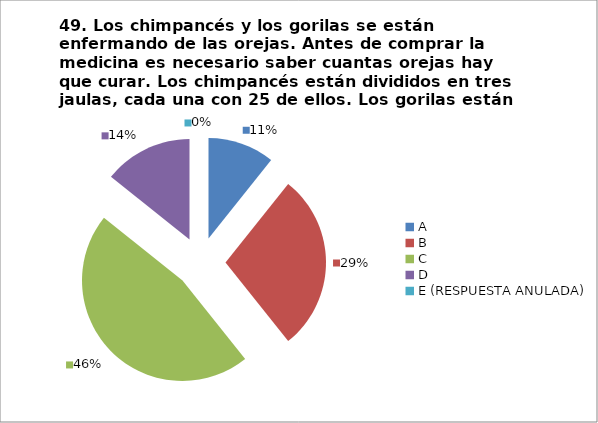
| Category | CANTIDAD DE RESPUESTAS PREGUNTA (49) | PORCENTAJE |
|---|---|---|
| A | 3 | 0.107 |
| B | 8 | 0.286 |
| C | 13 | 0.464 |
| D | 4 | 0.143 |
| E (RESPUESTA ANULADA) | 0 | 0 |